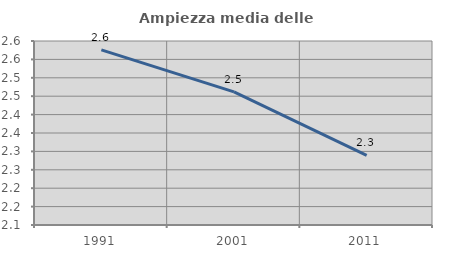
| Category | Ampiezza media delle famiglie |
|---|---|
| 1991.0 | 2.576 |
| 2001.0 | 2.462 |
| 2011.0 | 2.289 |